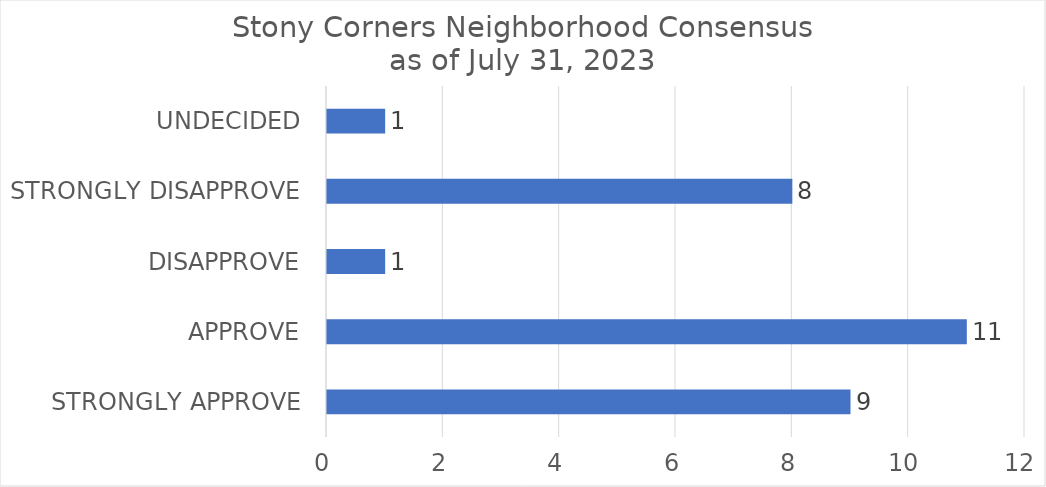
| Category | # |
|---|---|
| STRONGLY APPROVE | 9 |
| APPROVE | 11 |
| DISAPPROVE | 1 |
| STRONGLY DISAPPROVE | 8 |
| UNDECIDED | 1 |